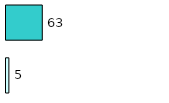
| Category | Series 0 | Series 1 |
|---|---|---|
| 0 | 5 | 63 |